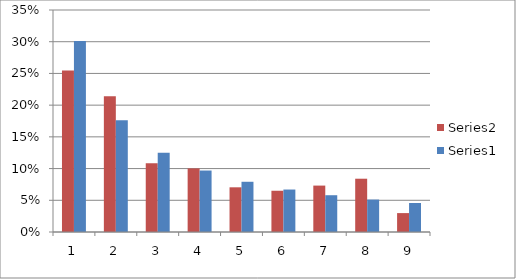
| Category | Series 1 | Series 0 |
|---|---|---|
| 0 | 0.255 | 0.301 |
| 1 | 0.214 | 0.176 |
| 2 | 0.108 | 0.125 |
| 3 | 0.1 | 0.097 |
| 4 | 0.07 | 0.079 |
| 5 | 0.065 | 0.067 |
| 6 | 0.073 | 0.058 |
| 7 | 0.084 | 0.051 |
| 8 | 0.03 | 0.046 |